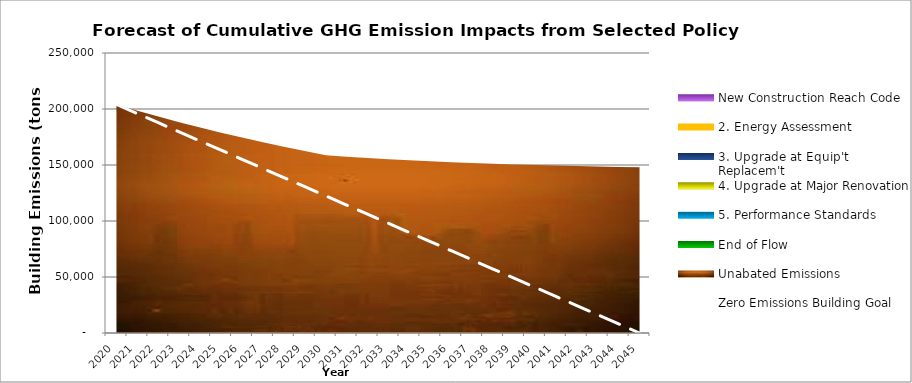
| Category | Zero Emissions Building Goal |
|---|---|
| 2020.0 | 204061.616 |
| 2021.0 | 195899.151 |
| 2022.0 | 187736.687 |
| 2023.0 | 179574.222 |
| 2024.0 | 171411.757 |
| 2025.0 | 163249.293 |
| 2026.0 | 155086.828 |
| 2027.0 | 146924.363 |
| 2028.0 | 138761.899 |
| 2029.0 | 130599.434 |
| 2030.0 | 122436.97 |
| 2031.0 | 114274.505 |
| 2032.0 | 106112.04 |
| 2033.0 | 97949.576 |
| 2034.0 | 89787.111 |
| 2035.0 | 81624.646 |
| 2036.0 | 73462.182 |
| 2037.0 | 65299.717 |
| 2038.0 | 57137.252 |
| 2039.0 | 48974.788 |
| 2040.0 | 40812.323 |
| 2041.0 | 32649.859 |
| 2042.0 | 24487.394 |
| 2043.0 | 16324.929 |
| 2044.0 | 8162.465 |
| 2045.0 | 0 |